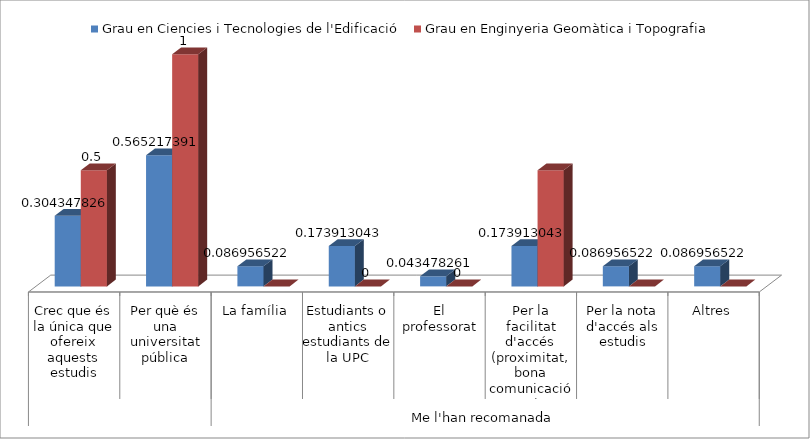
| Category | Grau en Ciencies i Tecnologies de l'Edificació | Grau en Enginyeria Geomàtica i Topografia |
|---|---|---|
| 0 | 0.304 | 0.5 |
| 1 | 0.565 | 1 |
| 2 | 0.087 | 0 |
| 3 | 0.174 | 0 |
| 4 | 0.043 | 0 |
| 5 | 0.174 | 0.5 |
| 6 | 0.087 | 0 |
| 7 | 0.087 | 0 |